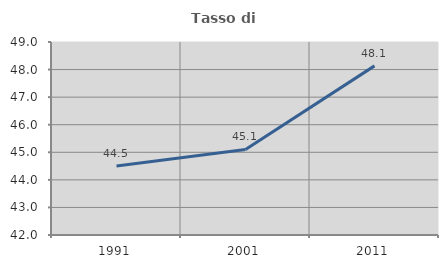
| Category | Tasso di occupazione   |
|---|---|
| 1991.0 | 44.504 |
| 2001.0 | 45.105 |
| 2011.0 | 48.134 |